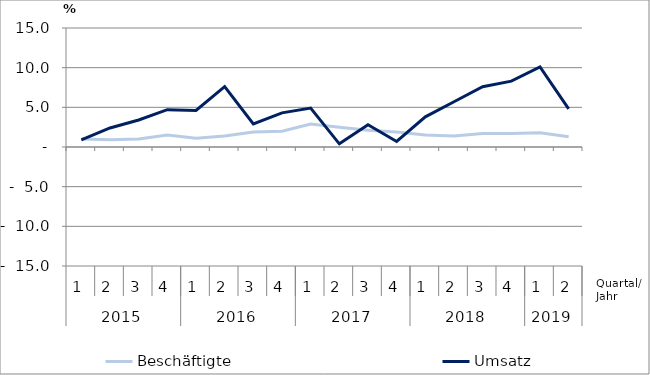
| Category | Beschäftigte | Umsatz |
|---|---|---|
| 0 | 1 | 0.9 |
| 1 | 0.9 | 2.4 |
| 2 | 1 | 3.4 |
| 3 | 1.5 | 4.7 |
| 4 | 1.1 | 4.6 |
| 5 | 1.4 | 7.6 |
| 6 | 1.9 | 2.9 |
| 7 | 2 | 4.3 |
| 8 | 2.9 | 4.9 |
| 9 | 2.5 | 0.4 |
| 10 | 2.1 | 2.8 |
| 11 | 1.9 | 0.7 |
| 12 | 1.5 | 3.8 |
| 13 | 1.4 | 5.7 |
| 14 | 1.7 | 7.6 |
| 15 | 1.7 | 8.3 |
| 16 | 1.8 | 10.1 |
| 17 | 1.3 | 4.8 |